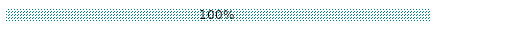
| Category | Conforme | Perfectible | Non conforme | Non concerné | À remplir |
|---|---|---|---|---|---|
| Conformité aux critères communs | 0 | 0 | 0 | 0 | 1 |